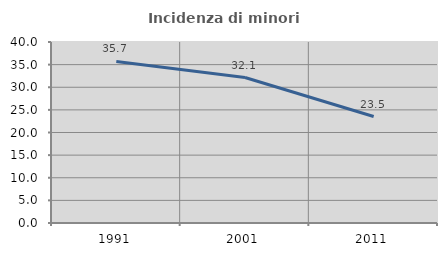
| Category | Incidenza di minori stranieri |
|---|---|
| 1991.0 | 35.714 |
| 2001.0 | 32.143 |
| 2011.0 | 23.529 |